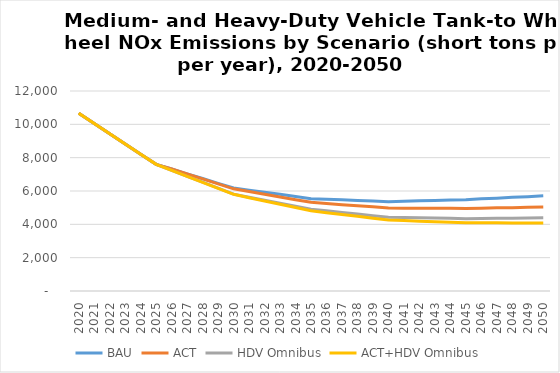
| Category | BAU | ACT | HDV Omnibus | ACT+HDV Omnibus |
|---|---|---|---|---|
| 2020.0 | 10660 | 10660 | 10660 | 10660 |
| 2021.0 | 10050 | 10050 | 10050 | 10050 |
| 2022.0 | 9440 | 9440 | 9440 | 9440 |
| 2023.0 | 8820 | 8820 | 8820 | 8820 |
| 2024.0 | 8210 | 8210 | 8210 | 8210 |
| 2025.0 | 7600 | 7600 | 7600 | 7600 |
| 2026.0 | 7320 | 7320 | 7240 | 7240 |
| 2027.0 | 7030 | 7020 | 6880 | 6880 |
| 2028.0 | 6750 | 6730 | 6530 | 6520 |
| 2029.0 | 6460 | 6430 | 6170 | 6160 |
| 2030.0 | 6180 | 6130 | 5810 | 5800 |
| 2031.0 | 6050 | 5970 | 5630 | 5600 |
| 2032.0 | 5920 | 5810 | 5450 | 5400 |
| 2033.0 | 5800 | 5640 | 5260 | 5210 |
| 2034.0 | 5670 | 5480 | 5080 | 5010 |
| 2035.0 | 5540 | 5320 | 4900 | 4810 |
| 2036.0 | 5500 | 5250 | 4810 | 4700 |
| 2037.0 | 5470 | 5180 | 4710 | 4590 |
| 2038.0 | 5430 | 5120 | 4620 | 4480 |
| 2039.0 | 5400 | 5050 | 4520 | 4370 |
| 2040.0 | 5360 | 4980 | 4430 | 4260 |
| 2041.0 | 5380 | 4970 | 4410 | 4230 |
| 2042.0 | 5410 | 4970 | 4390 | 4190 |
| 2043.0 | 5430 | 4960 | 4380 | 4160 |
| 2044.0 | 5460 | 4960 | 4360 | 4120 |
| 2045.0 | 5480 | 4950 | 4340 | 4090 |
| 2046.0 | 5530 | 4970 | 4350 | 4090 |
| 2047.0 | 5570 | 4990 | 4360 | 4090 |
| 2048.0 | 5620 | 5000 | 4370 | 4080 |
| 2049.0 | 5660 | 5020 | 4380 | 4080 |
| 2050.0 | 5710 | 5040 | 4390 | 4080 |